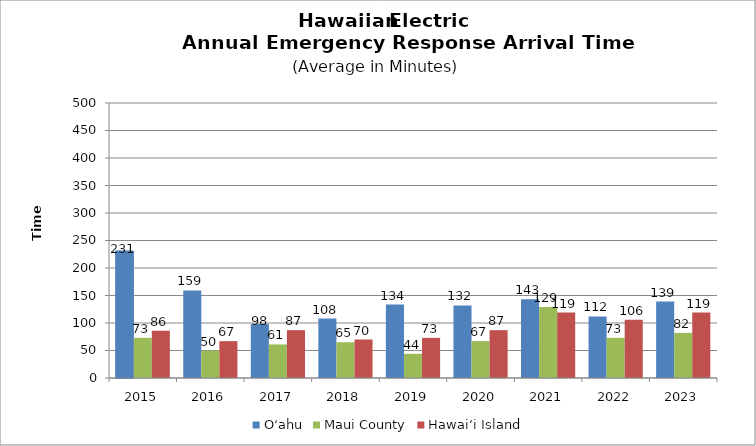
| Category | O‘ahu | Maui County | Hawai‘i Island |
|---|---|---|---|
| 2015.0 | 231 | 73 | 86 |
| 2016.0 | 159.21 | 50 | 67 |
| 2017.0 | 98.09 | 61 | 87 |
| 2018.0 | 108 | 65 | 70 |
| 2019.0 | 133.52 | 44 | 73 |
| 2020.0 | 132 | 67 | 87 |
| 2021.0 | 143 | 129 | 119 |
| 2022.0 | 112 | 73 | 106 |
| 2023.0 | 139 | 82 | 119 |